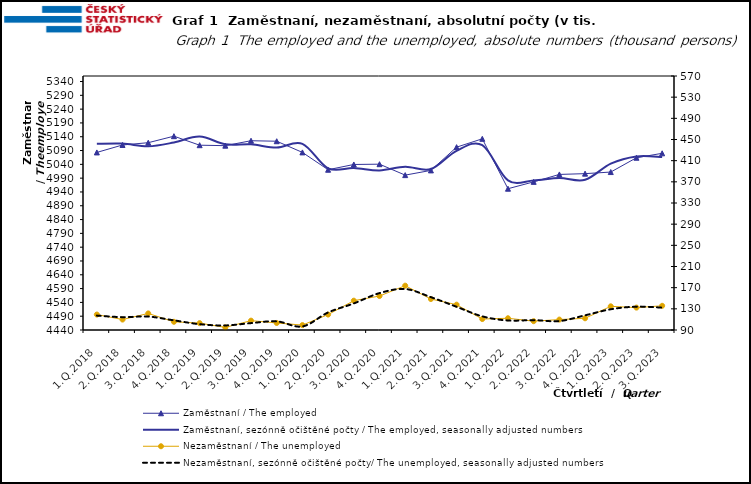
| Category | Zaměstnaní / The employed | Zaměstnaní, sezónně očištěné počty / The employed, seasonally adjusted numbers |
|---|---|---|
| 1.Q.2018 | 5083.179 | 5114.199 |
| 2.Q.2018 | 5110.163 | 5115.181 |
| 3.Q.2018 | 5118.428 | 5105.31 |
| 4.Q.2018 | 5142.05 | 5119.147 |
| 1.Q.2019 | 5109.352 | 5140.524 |
| 2.Q.2019 | 5107.692 | 5112.705 |
| 3.Q.2019 | 5125.549 | 5112.392 |
| 4.Q.2019 | 5123.768 | 5100.959 |
| 1.Q.2020 | 5083.305 | 5114.348 |
| 2.Q.2020 | 5020.458 | 5025.373 |
| 3.Q.2020 | 5039.545 | 5026.587 |
| 4.Q.2020 | 5040.581 | 5018.14 |
| 1.Q.2021 | 5001.014 | 5031.579 |
| 2.Q.2021 | 5018.083 | 5022.992 |
| 3.Q.2021 | 5102.241 | 5089.111 |
| 4.Q.2021 | 5132.436 | 5109.58 |
| 1.Q.2022 | 4951.782 | 4982.071 |
| 2.Q.2022 | 4976.52 | 4981.37 |
| 3.Q.2022 | 5003.507 | 4990.616 |
| 4.Q.2022 | 5006.314 | 4984.042 |
| 1.Q.2023 | 5012.111 | 5042.79 |
| 2.Q.2023 | 5063.915 | 5068.823 |
| 3.Q.2023 | 5079.916 | 5066.82 |